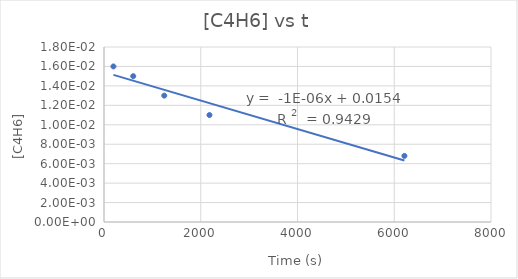
| Category | Series 0 |
|---|---|
| 195.0 | 0.016 |
| 604.0 | 0.015 |
| 1246.0 | 0.013 |
| 2180.0 | 0.011 |
| 6210.0 | 0.007 |